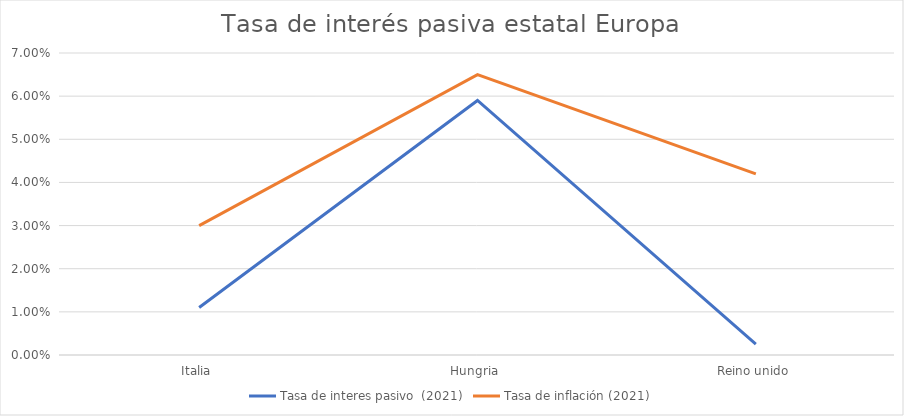
| Category | Tasa de interes pasivo  (2021) | Tasa de inflación (2021) |
|---|---|---|
| Italia | 0.011 | 0.03 |
| Hungria | 0.059 | 0.065 |
| Reino unido | 0.002 | 0.042 |